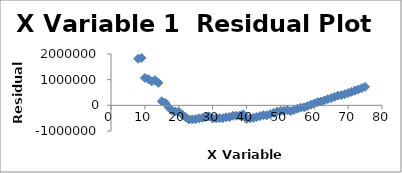
| Category | Series 0 |
|---|---|
| 8.0 | 1814183.556 |
| 9.0 | 1849759.143 |
| 10.0 | 1068217.729 |
| 11.0 | 1024200.316 |
| 12.0 | 934719.902 |
| 13.0 | 981082.489 |
| 14.0 | 876153.076 |
| 15.0 | 158825.662 |
| 16.0 | 97621.249 |
| 17.0 | -77454.165 |
| 18.0 | -208085.578 |
| 19.0 | -237303.992 |
| 20.0 | -250217.405 |
| 21.0 | -356977.819 |
| 22.0 | -458681.232 |
| 23.0 | -548680.645 |
| 24.0 | -547275.059 |
| 25.0 | -538849.472 |
| 26.0 | -506659.886 |
| 27.0 | -486646.299 |
| 28.0 | -456044.713 |
| 29.0 | -431712.126 |
| 30.0 | -514282.54 |
| 31.0 | -507099.953 |
| 32.0 | -499447.366 |
| 33.0 | -503377.78 |
| 34.0 | -463307.193 |
| 35.0 | -453083.607 |
| 36.0 | -405043.02 |
| 37.0 | -403303.434 |
| 38.0 | -399450.847 |
| 39.0 | -347145.261 |
| 40.0 | -529494.674 |
| 41.0 | -503260.087 |
| 42.0 | -490565.501 |
| 43.0 | -455904.914 |
| 44.0 | -421658.328 |
| 45.0 | -383557.741 |
| 46.0 | -386310.155 |
| 47.0 | -342299.568 |
| 48.0 | -295269.982 |
| 49.0 | -243455.395 |
| 50.0 | -216651.808 |
| 51.0 | -217596.222 |
| 52.0 | -185937.635 |
| 53.0 | -228146.049 |
| 54.0 | -181341.462 |
| 55.0 | -131729.876 |
| 56.0 | -88003.289 |
| 57.0 | -75383.703 |
| 58.0 | -29471.116 |
| 59.0 | 24071.471 |
| 60.0 | 69814.057 |
| 61.0 | 122163.644 |
| 62.0 | 147560.23 |
| 63.0 | 193538.817 |
| 64.0 | 244551.403 |
| 65.0 | 281893.99 |
| 66.0 | 331014.576 |
| 67.0 | 378040.163 |
| 68.0 | 396402.75 |
| 69.0 | 431494.336 |
| 70.0 | 479708.923 |
| 71.0 | 522281.509 |
| 72.0 | 575153.096 |
| 73.0 | 617567.682 |
| 74.0 | 666774.269 |
| 75.0 | 719372.855 |